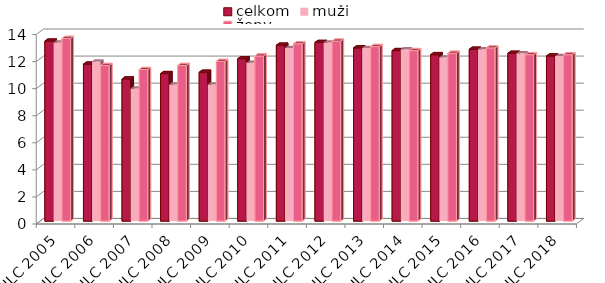
| Category | celkom | muži | ženy |
|---|---|---|---|
| EU SILC 2005 | 13.3 | 13.2 | 13.5 |
| EU SILC 2006 | 11.6 | 11.8 | 11.5 |
| EU SILC 2007 | 10.5 | 9.8 | 11.2 |
| EU SILC 2008 | 10.9 | 10.1 | 11.5 |
| EU SILC 2009 | 11 | 10.1 | 11.8 |
| EU SILC 2010 | 12 | 11.7 | 12.2 |
| EU SILC 2011 | 13 | 12.8 | 13.1 |
| EU SILC 2012 | 13.2 | 13.2 | 13.3 |
| EU SILC 2013 | 12.8 | 12.8 | 12.9 |
| EU SILC 2014 | 12.6 | 12.7 | 12.6 |
| EU SILC 2015 | 12.3 | 12.1 | 12.4 |
| EU SILC 2016 | 12.7 | 12.7 | 12.8 |
| EU SILC 2017 | 12.4 | 12.4 | 12.3 |
| EU SILC 2018 | 12.2 | 12.2 | 12.3 |